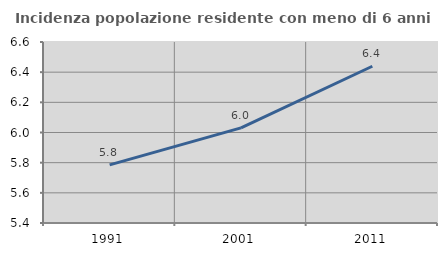
| Category | Incidenza popolazione residente con meno di 6 anni |
|---|---|
| 1991.0 | 5.785 |
| 2001.0 | 6.031 |
| 2011.0 | 6.439 |